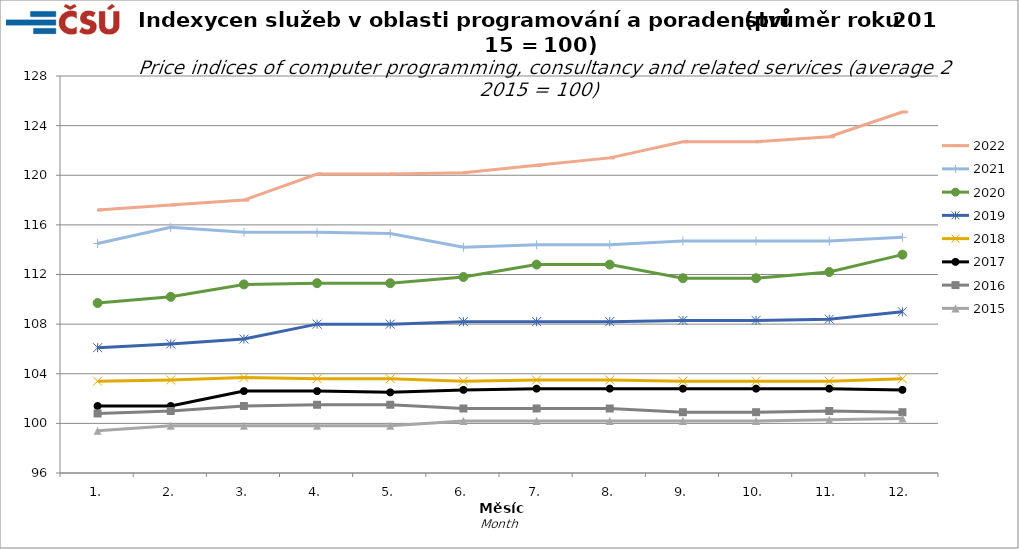
| Category | 2022 | 2021 | 2020 | 2019 | 2018 | 2017 | 2016 | 2015 |
|---|---|---|---|---|---|---|---|---|
| 1. | 117.2 | 114.5 | 109.7 | 106.1 | 103.4 | 101.4 | 100.8 | 99.4 |
| 2. | 117.6 | 115.8 | 110.2 | 106.4 | 103.5 | 101.4 | 101 | 99.8 |
| 3. | 118 | 115.4 | 111.2 | 106.8 | 103.7 | 102.6 | 101.4 | 99.8 |
| 4. | 120.1 | 115.4 | 111.3 | 108 | 103.6 | 102.6 | 101.5 | 99.8 |
| 5. | 120.1 | 115.3 | 111.3 | 108 | 103.6 | 102.5 | 101.5 | 99.8 |
| 6. | 120.2 | 114.2 | 111.8 | 108.2 | 103.4 | 102.7 | 101.2 | 100.2 |
| 7. | 120.8 | 114.4 | 112.8 | 108.2 | 103.5 | 102.8 | 101.2 | 100.2 |
| 8. | 121.4 | 114.4 | 112.8 | 108.2 | 103.5 | 102.8 | 101.2 | 100.2 |
| 9. | 122.7 | 114.7 | 111.7 | 108.3 | 103.4 | 102.8 | 100.9 | 100.2 |
| 10. | 122.7 | 114.7 | 111.7 | 108.3 | 103.4 | 102.8 | 100.9 | 100.2 |
| 11. | 123.1 | 114.7 | 112.2 | 108.4 | 103.4 | 102.8 | 101 | 100.3 |
| 12. | 125.1 | 115 | 113.6 | 109 | 103.6 | 102.7 | 100.9 | 100.4 |